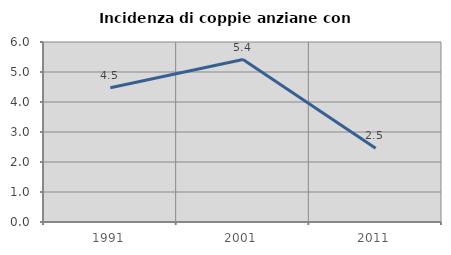
| Category | Incidenza di coppie anziane con figli |
|---|---|
| 1991.0 | 4.478 |
| 2001.0 | 5.414 |
| 2011.0 | 2.456 |